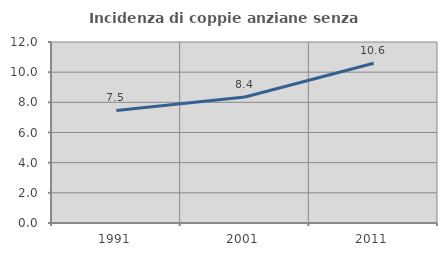
| Category | Incidenza di coppie anziane senza figli  |
|---|---|
| 1991.0 | 7.463 |
| 2001.0 | 8.352 |
| 2011.0 | 10.593 |